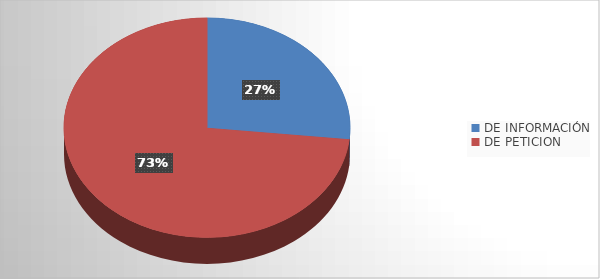
| Category | Series 0 |
|---|---|
| DE INFORMACIÓN | 4 |
| DE PETICION | 11 |